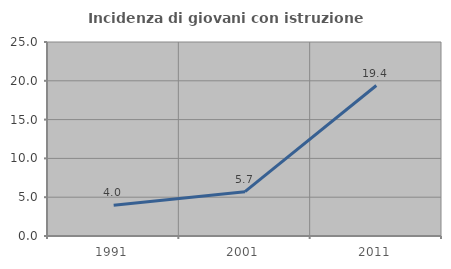
| Category | Incidenza di giovani con istruzione universitaria |
|---|---|
| 1991.0 | 3.962 |
| 2001.0 | 5.711 |
| 2011.0 | 19.394 |